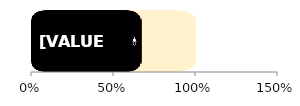
| Category | Total | Male |
|---|---|---|
| 0 | 1 | 0.67 |